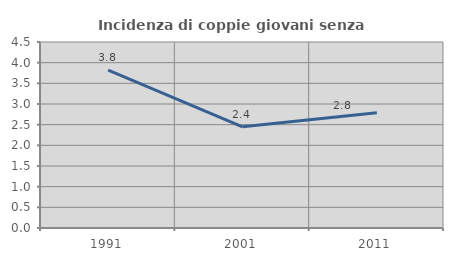
| Category | Incidenza di coppie giovani senza figli |
|---|---|
| 1991.0 | 3.822 |
| 2001.0 | 2.448 |
| 2011.0 | 2.789 |